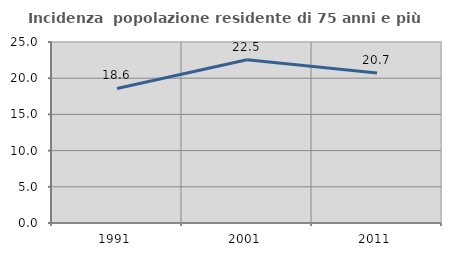
| Category | Incidenza  popolazione residente di 75 anni e più |
|---|---|
| 1991.0 | 18.587 |
| 2001.0 | 22.541 |
| 2011.0 | 20.703 |